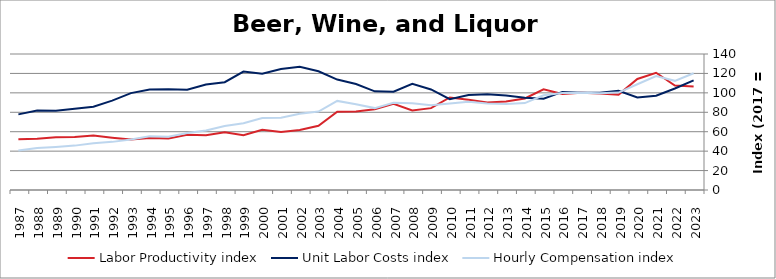
| Category | Labor Productivity index | Unit Labor Costs index | Hourly Compensation index |
|---|---|---|---|
| 2023.0 | 106.488 | 112.859 | 120.18 |
| 2022.0 | 107.528 | 104.505 | 112.372 |
| 2021.0 | 120.719 | 97.11 | 117.23 |
| 2020.0 | 114.329 | 95.213 | 108.856 |
| 2019.0 | 98.198 | 102.115 | 100.275 |
| 2018.0 | 99.423 | 100.197 | 99.619 |
| 2017.0 | 100 | 100 | 100 |
| 2016.0 | 98.752 | 100.987 | 99.727 |
| 2015.0 | 103.698 | 94.05 | 97.528 |
| 2014.0 | 94.247 | 94.939 | 89.477 |
| 2013.0 | 91.025 | 97.173 | 88.452 |
| 2012.0 | 90.131 | 98.689 | 88.95 |
| 2011.0 | 93.001 | 97.764 | 90.922 |
| 2010.0 | 95.314 | 93.444 | 89.064 |
| 2009.0 | 84.262 | 103.488 | 87.201 |
| 2008.0 | 81.781 | 109.257 | 89.351 |
| 2007.0 | 88.828 | 101.107 | 89.812 |
| 2006.0 | 83.02 | 101.555 | 84.311 |
| 2005.0 | 80.927 | 109.1 | 88.291 |
| 2004.0 | 80.68 | 113.682 | 91.719 |
| 2003.0 | 66.122 | 122.201 | 80.801 |
| 2002.0 | 61.806 | 126.897 | 78.43 |
| 2001.0 | 59.774 | 124.538 | 74.441 |
| 2000.0 | 61.964 | 119.692 | 74.166 |
| 1999.0 | 56.331 | 121.949 | 68.696 |
| 1998.0 | 59.426 | 110.948 | 65.932 |
| 1997.0 | 56.356 | 108.573 | 61.188 |
| 1996.0 | 56.907 | 103.176 | 58.714 |
| 1995.0 | 52.929 | 103.675 | 54.874 |
| 1994.0 | 53.499 | 103.437 | 55.338 |
| 1993.0 | 52.005 | 99.757 | 51.878 |
| 1992.0 | 53.851 | 92.002 | 49.544 |
| 1991.0 | 56.092 | 85.762 | 48.106 |
| 1990.0 | 54.676 | 83.558 | 45.686 |
| 1989.0 | 54.293 | 81.576 | 44.29 |
| 1988.0 | 52.778 | 81.793 | 43.169 |
| 1987.0 | 52.214 | 77.86 | 40.654 |